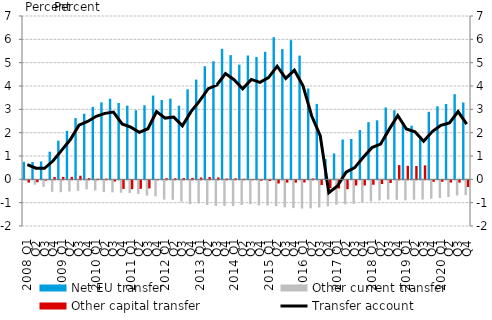
| Category | Net EU transfer | Other current transfer | Other capital transfer |
|---|---|---|---|
| 2008 Q1 | 0.751 | -0.024 | -0.097 |
| Q2 | 0.744 | -0.185 | -0.082 |
| Q3 | 0.767 | -0.28 | -0.013 |
| Q4 | 1.184 | -0.492 | 0.103 |
| 2009 Q1 | 1.657 | -0.508 | 0.104 |
| Q2 | 2.079 | -0.478 | 0.104 |
| Q3 | 2.623 | -0.454 | 0.154 |
| Q4 | 2.81 | -0.383 | 0.054 |
| 2010 Q1 | 3.109 | -0.433 | 0.026 |
| Q2 | 3.3 | -0.499 | 0.028 |
| Q3 | 3.453 | -0.516 | -0.051 |
| Q4 | 3.273 | -0.531 | -0.368 |
| 2011 Q1 | 3.158 | -0.545 | -0.38 |
| Q2 | 2.962 | -0.583 | -0.365 |
| Q3 | 3.173 | -0.657 | -0.347 |
| Q4 | 3.589 | -0.687 | 0.007 |
| 2012 Q1 | 3.401 | -0.827 | 0.051 |
| Q2 | 3.46 | -0.836 | 0.045 |
| Q3 | 3.158 | -0.914 | 0.053 |
| Q4 | 3.857 | -1.019 | 0.064 |
| 2013 Q1 | 4.276 | -0.994 | 0.079 |
| Q2 | 4.849 | -1.061 | 0.099 |
| Q3 | 5.058 | -1.097 | 0.081 |
| Q4 | 5.594 | -1.097 | 0.034 |
| 2014 Q1 | 5.324 | -1.099 | 0.044 |
| Q2 | 4.915 | -1.057 | 0.021 |
| Q3 | 5.307 | -1.024 | 0 |
| Q4 | 5.245 | -1.073 | -0.019 |
| 2015 Q1 | 5.465 | -1.078 | -0.029 |
| Q2 | 6.092 | -1.107 | -0.136 |
| Q3 | 5.581 | -1.157 | -0.1 |
| Q4 | 5.965 | -1.19 | -0.099 |
| 2016 Q1 | 5.304 | -1.207 | -0.092 |
| Q2 | 3.89 | -1.201 | 0.037 |
| Q3 | 3.233 | -1.163 | -0.201 |
| Q4 | 0.873 | -1.112 | -0.331 |
| 2017 Q1 | 1.11 | -1.044 | -0.35 |
| Q2 | 1.708 | -1.023 | -0.381 |
| Q3 | 1.729 | -1.004 | -0.223 |
| Q4 | 2.112 | -0.95 | -0.219 |
| 2018 Q1 | 2.453 | -0.904 | -0.19 |
| Q2 | 2.529 | -0.863 | -0.158 |
| Q3 | 3.077 | -0.822 | -0.114 |
| Q4 | 2.963 | -0.836 | 0.61 |
| 2019 Q1 | 2.435 | -0.858 | 0.579 |
| Q2 | 2.299 | -0.831 | 0.571 |
| Q3 | 1.855 | -0.826 | 0.601 |
| Q4 | 2.895 | -0.788 | -0.062 |
| 2020 Q1 | 3.131 | -0.757 | -0.062 |
| Q2 | 3.231 | -0.718 | -0.093 |
| Q3 | 3.651 | -0.647 | -0.099 |
| Q4 | 3.292 | -0.636 | -0.287 |